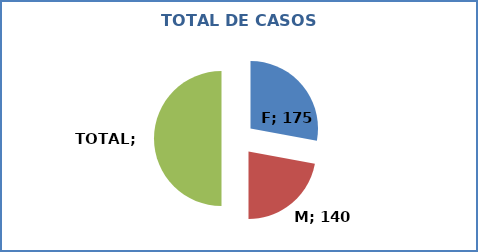
| Category | Series 0 |
|---|---|
| F | 174 |
| M | 138 |
| TOTAL | 312 |